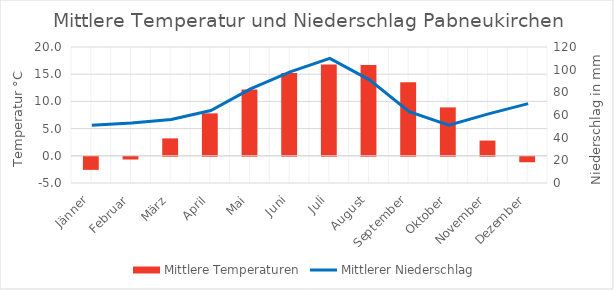
| Category | Mittlere Temperaturen |
|---|---|
| Jänner | -2.4 |
| Februar | -0.5 |
| März | 3.2 |
| April | 7.8 |
| Mai | 12.2 |
| Juni | 15.2 |
| Juli | 16.8 |
| August | 16.7 |
| September | 13.5 |
| Oktober | 8.9 |
| November | 2.8 |
| Dezember | -1 |